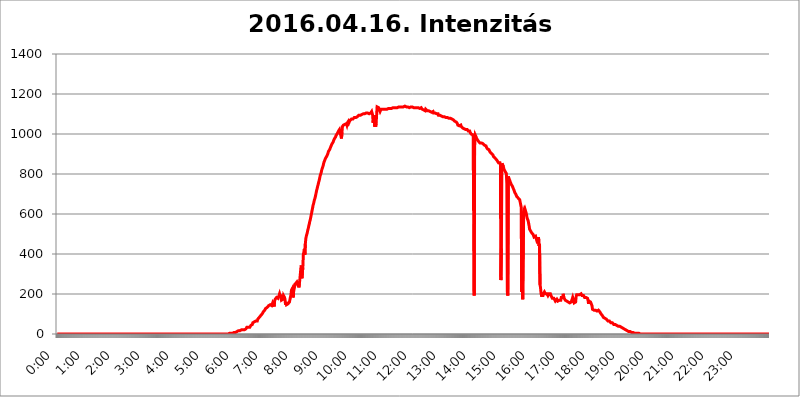
| Category | 2016.04.16. Intenzitás [W/m^2] |
|---|---|
| 0.0 | 0 |
| 0.0006944444444444445 | 0 |
| 0.001388888888888889 | 0 |
| 0.0020833333333333333 | 0 |
| 0.002777777777777778 | 0 |
| 0.003472222222222222 | 0 |
| 0.004166666666666667 | 0 |
| 0.004861111111111111 | 0 |
| 0.005555555555555556 | 0 |
| 0.0062499999999999995 | 0 |
| 0.006944444444444444 | 0 |
| 0.007638888888888889 | 0 |
| 0.008333333333333333 | 0 |
| 0.009027777777777779 | 0 |
| 0.009722222222222222 | 0 |
| 0.010416666666666666 | 0 |
| 0.011111111111111112 | 0 |
| 0.011805555555555555 | 0 |
| 0.012499999999999999 | 0 |
| 0.013194444444444444 | 0 |
| 0.013888888888888888 | 0 |
| 0.014583333333333332 | 0 |
| 0.015277777777777777 | 0 |
| 0.015972222222222224 | 0 |
| 0.016666666666666666 | 0 |
| 0.017361111111111112 | 0 |
| 0.018055555555555557 | 0 |
| 0.01875 | 0 |
| 0.019444444444444445 | 0 |
| 0.02013888888888889 | 0 |
| 0.020833333333333332 | 0 |
| 0.02152777777777778 | 0 |
| 0.022222222222222223 | 0 |
| 0.02291666666666667 | 0 |
| 0.02361111111111111 | 0 |
| 0.024305555555555556 | 0 |
| 0.024999999999999998 | 0 |
| 0.025694444444444447 | 0 |
| 0.02638888888888889 | 0 |
| 0.027083333333333334 | 0 |
| 0.027777777777777776 | 0 |
| 0.02847222222222222 | 0 |
| 0.029166666666666664 | 0 |
| 0.029861111111111113 | 0 |
| 0.030555555555555555 | 0 |
| 0.03125 | 0 |
| 0.03194444444444445 | 0 |
| 0.03263888888888889 | 0 |
| 0.03333333333333333 | 0 |
| 0.034027777777777775 | 0 |
| 0.034722222222222224 | 0 |
| 0.035416666666666666 | 0 |
| 0.036111111111111115 | 0 |
| 0.03680555555555556 | 0 |
| 0.0375 | 0 |
| 0.03819444444444444 | 0 |
| 0.03888888888888889 | 0 |
| 0.03958333333333333 | 0 |
| 0.04027777777777778 | 0 |
| 0.04097222222222222 | 0 |
| 0.041666666666666664 | 0 |
| 0.042361111111111106 | 0 |
| 0.04305555555555556 | 0 |
| 0.043750000000000004 | 0 |
| 0.044444444444444446 | 0 |
| 0.04513888888888889 | 0 |
| 0.04583333333333334 | 0 |
| 0.04652777777777778 | 0 |
| 0.04722222222222222 | 0 |
| 0.04791666666666666 | 0 |
| 0.04861111111111111 | 0 |
| 0.049305555555555554 | 0 |
| 0.049999999999999996 | 0 |
| 0.05069444444444445 | 0 |
| 0.051388888888888894 | 0 |
| 0.052083333333333336 | 0 |
| 0.05277777777777778 | 0 |
| 0.05347222222222222 | 0 |
| 0.05416666666666667 | 0 |
| 0.05486111111111111 | 0 |
| 0.05555555555555555 | 0 |
| 0.05625 | 0 |
| 0.05694444444444444 | 0 |
| 0.057638888888888885 | 0 |
| 0.05833333333333333 | 0 |
| 0.05902777777777778 | 0 |
| 0.059722222222222225 | 0 |
| 0.06041666666666667 | 0 |
| 0.061111111111111116 | 0 |
| 0.06180555555555556 | 0 |
| 0.0625 | 0 |
| 0.06319444444444444 | 0 |
| 0.06388888888888888 | 0 |
| 0.06458333333333334 | 0 |
| 0.06527777777777778 | 0 |
| 0.06597222222222222 | 0 |
| 0.06666666666666667 | 0 |
| 0.06736111111111111 | 0 |
| 0.06805555555555555 | 0 |
| 0.06874999999999999 | 0 |
| 0.06944444444444443 | 0 |
| 0.07013888888888889 | 0 |
| 0.07083333333333333 | 0 |
| 0.07152777777777779 | 0 |
| 0.07222222222222223 | 0 |
| 0.07291666666666667 | 0 |
| 0.07361111111111111 | 0 |
| 0.07430555555555556 | 0 |
| 0.075 | 0 |
| 0.07569444444444444 | 0 |
| 0.0763888888888889 | 0 |
| 0.07708333333333334 | 0 |
| 0.07777777777777778 | 0 |
| 0.07847222222222222 | 0 |
| 0.07916666666666666 | 0 |
| 0.0798611111111111 | 0 |
| 0.08055555555555556 | 0 |
| 0.08125 | 0 |
| 0.08194444444444444 | 0 |
| 0.08263888888888889 | 0 |
| 0.08333333333333333 | 0 |
| 0.08402777777777777 | 0 |
| 0.08472222222222221 | 0 |
| 0.08541666666666665 | 0 |
| 0.08611111111111112 | 0 |
| 0.08680555555555557 | 0 |
| 0.08750000000000001 | 0 |
| 0.08819444444444445 | 0 |
| 0.08888888888888889 | 0 |
| 0.08958333333333333 | 0 |
| 0.09027777777777778 | 0 |
| 0.09097222222222222 | 0 |
| 0.09166666666666667 | 0 |
| 0.09236111111111112 | 0 |
| 0.09305555555555556 | 0 |
| 0.09375 | 0 |
| 0.09444444444444444 | 0 |
| 0.09513888888888888 | 0 |
| 0.09583333333333333 | 0 |
| 0.09652777777777777 | 0 |
| 0.09722222222222222 | 0 |
| 0.09791666666666667 | 0 |
| 0.09861111111111111 | 0 |
| 0.09930555555555555 | 0 |
| 0.09999999999999999 | 0 |
| 0.10069444444444443 | 0 |
| 0.1013888888888889 | 0 |
| 0.10208333333333335 | 0 |
| 0.10277777777777779 | 0 |
| 0.10347222222222223 | 0 |
| 0.10416666666666667 | 0 |
| 0.10486111111111111 | 0 |
| 0.10555555555555556 | 0 |
| 0.10625 | 0 |
| 0.10694444444444444 | 0 |
| 0.1076388888888889 | 0 |
| 0.10833333333333334 | 0 |
| 0.10902777777777778 | 0 |
| 0.10972222222222222 | 0 |
| 0.1111111111111111 | 0 |
| 0.11180555555555556 | 0 |
| 0.11180555555555556 | 0 |
| 0.1125 | 0 |
| 0.11319444444444444 | 0 |
| 0.11388888888888889 | 0 |
| 0.11458333333333333 | 0 |
| 0.11527777777777777 | 0 |
| 0.11597222222222221 | 0 |
| 0.11666666666666665 | 0 |
| 0.1173611111111111 | 0 |
| 0.11805555555555557 | 0 |
| 0.11944444444444445 | 0 |
| 0.12013888888888889 | 0 |
| 0.12083333333333333 | 0 |
| 0.12152777777777778 | 0 |
| 0.12222222222222223 | 0 |
| 0.12291666666666667 | 0 |
| 0.12291666666666667 | 0 |
| 0.12361111111111112 | 0 |
| 0.12430555555555556 | 0 |
| 0.125 | 0 |
| 0.12569444444444444 | 0 |
| 0.12638888888888888 | 0 |
| 0.12708333333333333 | 0 |
| 0.16875 | 0 |
| 0.12847222222222224 | 0 |
| 0.12916666666666668 | 0 |
| 0.12986111111111112 | 0 |
| 0.13055555555555556 | 0 |
| 0.13125 | 0 |
| 0.13194444444444445 | 0 |
| 0.1326388888888889 | 0 |
| 0.13333333333333333 | 0 |
| 0.13402777777777777 | 0 |
| 0.13402777777777777 | 0 |
| 0.13472222222222222 | 0 |
| 0.13541666666666666 | 0 |
| 0.1361111111111111 | 0 |
| 0.13749999999999998 | 0 |
| 0.13819444444444443 | 0 |
| 0.1388888888888889 | 0 |
| 0.13958333333333334 | 0 |
| 0.14027777777777778 | 0 |
| 0.14097222222222222 | 0 |
| 0.14166666666666666 | 0 |
| 0.1423611111111111 | 0 |
| 0.14305555555555557 | 0 |
| 0.14375000000000002 | 0 |
| 0.14444444444444446 | 0 |
| 0.1451388888888889 | 0 |
| 0.1451388888888889 | 0 |
| 0.14652777777777778 | 0 |
| 0.14722222222222223 | 0 |
| 0.14791666666666667 | 0 |
| 0.1486111111111111 | 0 |
| 0.14930555555555555 | 0 |
| 0.15 | 0 |
| 0.15069444444444444 | 0 |
| 0.15138888888888888 | 0 |
| 0.15208333333333332 | 0 |
| 0.15277777777777776 | 0 |
| 0.15347222222222223 | 0 |
| 0.15416666666666667 | 0 |
| 0.15486111111111112 | 0 |
| 0.15555555555555556 | 0 |
| 0.15625 | 0 |
| 0.15694444444444444 | 0 |
| 0.15763888888888888 | 0 |
| 0.15833333333333333 | 0 |
| 0.15902777777777777 | 0 |
| 0.15972222222222224 | 0 |
| 0.16041666666666668 | 0 |
| 0.16111111111111112 | 0 |
| 0.16180555555555556 | 0 |
| 0.1625 | 0 |
| 0.16319444444444445 | 0 |
| 0.1638888888888889 | 0 |
| 0.16458333333333333 | 0 |
| 0.16527777777777777 | 0 |
| 0.16597222222222222 | 0 |
| 0.16666666666666666 | 0 |
| 0.1673611111111111 | 0 |
| 0.16805555555555554 | 0 |
| 0.16874999999999998 | 0 |
| 0.16944444444444443 | 0 |
| 0.17013888888888887 | 0 |
| 0.1708333333333333 | 0 |
| 0.17152777777777775 | 0 |
| 0.17222222222222225 | 0 |
| 0.1729166666666667 | 0 |
| 0.17361111111111113 | 0 |
| 0.17430555555555557 | 0 |
| 0.17500000000000002 | 0 |
| 0.17569444444444446 | 0 |
| 0.1763888888888889 | 0 |
| 0.17708333333333334 | 0 |
| 0.17777777777777778 | 0 |
| 0.17847222222222223 | 0 |
| 0.17916666666666667 | 0 |
| 0.1798611111111111 | 0 |
| 0.18055555555555555 | 0 |
| 0.18125 | 0 |
| 0.18194444444444444 | 0 |
| 0.1826388888888889 | 0 |
| 0.18333333333333335 | 0 |
| 0.1840277777777778 | 0 |
| 0.18472222222222223 | 0 |
| 0.18541666666666667 | 0 |
| 0.18611111111111112 | 0 |
| 0.18680555555555556 | 0 |
| 0.1875 | 0 |
| 0.18819444444444444 | 0 |
| 0.18888888888888888 | 0 |
| 0.18958333333333333 | 0 |
| 0.19027777777777777 | 0 |
| 0.1909722222222222 | 0 |
| 0.19166666666666665 | 0 |
| 0.19236111111111112 | 0 |
| 0.19305555555555554 | 0 |
| 0.19375 | 0 |
| 0.19444444444444445 | 0 |
| 0.1951388888888889 | 0 |
| 0.19583333333333333 | 0 |
| 0.19652777777777777 | 0 |
| 0.19722222222222222 | 0 |
| 0.19791666666666666 | 0 |
| 0.1986111111111111 | 0 |
| 0.19930555555555554 | 0 |
| 0.19999999999999998 | 0 |
| 0.20069444444444443 | 0 |
| 0.20138888888888887 | 0 |
| 0.2020833333333333 | 0 |
| 0.2027777777777778 | 0 |
| 0.2034722222222222 | 0 |
| 0.2041666666666667 | 0 |
| 0.20486111111111113 | 0 |
| 0.20555555555555557 | 0 |
| 0.20625000000000002 | 0 |
| 0.20694444444444446 | 0 |
| 0.2076388888888889 | 0 |
| 0.20833333333333334 | 0 |
| 0.20902777777777778 | 0 |
| 0.20972222222222223 | 0 |
| 0.21041666666666667 | 0 |
| 0.2111111111111111 | 0 |
| 0.21180555555555555 | 0 |
| 0.2125 | 0 |
| 0.21319444444444444 | 0 |
| 0.2138888888888889 | 0 |
| 0.21458333333333335 | 0 |
| 0.2152777777777778 | 0 |
| 0.21597222222222223 | 0 |
| 0.21666666666666667 | 0 |
| 0.21736111111111112 | 0 |
| 0.21805555555555556 | 0 |
| 0.21875 | 0 |
| 0.21944444444444444 | 0 |
| 0.22013888888888888 | 0 |
| 0.22083333333333333 | 0 |
| 0.22152777777777777 | 0 |
| 0.2222222222222222 | 0 |
| 0.22291666666666665 | 0 |
| 0.2236111111111111 | 0 |
| 0.22430555555555556 | 0 |
| 0.225 | 0 |
| 0.22569444444444445 | 0 |
| 0.2263888888888889 | 0 |
| 0.22708333333333333 | 0 |
| 0.22777777777777777 | 0 |
| 0.22847222222222222 | 0 |
| 0.22916666666666666 | 0 |
| 0.2298611111111111 | 0 |
| 0.23055555555555554 | 0 |
| 0.23124999999999998 | 0 |
| 0.23194444444444443 | 0 |
| 0.23263888888888887 | 0 |
| 0.2333333333333333 | 0 |
| 0.2340277777777778 | 0 |
| 0.2347222222222222 | 0 |
| 0.2354166666666667 | 0 |
| 0.23611111111111113 | 0 |
| 0.23680555555555557 | 0 |
| 0.23750000000000002 | 0 |
| 0.23819444444444446 | 0 |
| 0.2388888888888889 | 0 |
| 0.23958333333333334 | 0 |
| 0.24027777777777778 | 0 |
| 0.24097222222222223 | 0 |
| 0.24166666666666667 | 3.525 |
| 0.2423611111111111 | 3.525 |
| 0.24305555555555555 | 3.525 |
| 0.24375 | 3.525 |
| 0.24444444444444446 | 3.525 |
| 0.24513888888888888 | 3.525 |
| 0.24583333333333335 | 3.525 |
| 0.2465277777777778 | 3.525 |
| 0.24722222222222223 | 7.887 |
| 0.24791666666666667 | 7.887 |
| 0.24861111111111112 | 7.887 |
| 0.24930555555555556 | 7.887 |
| 0.25 | 7.887 |
| 0.25069444444444444 | 12.257 |
| 0.2513888888888889 | 12.257 |
| 0.2520833333333333 | 12.257 |
| 0.25277777777777777 | 12.257 |
| 0.2534722222222222 | 12.257 |
| 0.25416666666666665 | 16.636 |
| 0.2548611111111111 | 16.636 |
| 0.2555555555555556 | 16.636 |
| 0.25625000000000003 | 16.636 |
| 0.2569444444444445 | 16.636 |
| 0.2576388888888889 | 21.024 |
| 0.25833333333333336 | 21.024 |
| 0.2590277777777778 | 21.024 |
| 0.25972222222222224 | 21.024 |
| 0.2604166666666667 | 21.024 |
| 0.2611111111111111 | 21.024 |
| 0.26180555555555557 | 21.024 |
| 0.2625 | 21.024 |
| 0.26319444444444445 | 25.419 |
| 0.2638888888888889 | 25.419 |
| 0.26458333333333334 | 25.419 |
| 0.2652777777777778 | 29.823 |
| 0.2659722222222222 | 34.234 |
| 0.26666666666666666 | 34.234 |
| 0.2673611111111111 | 34.234 |
| 0.26805555555555555 | 34.234 |
| 0.26875 | 34.234 |
| 0.26944444444444443 | 34.234 |
| 0.2701388888888889 | 34.234 |
| 0.2708333333333333 | 38.653 |
| 0.27152777777777776 | 43.079 |
| 0.2722222222222222 | 47.511 |
| 0.27291666666666664 | 47.511 |
| 0.2736111111111111 | 47.511 |
| 0.2743055555555555 | 56.398 |
| 0.27499999999999997 | 60.85 |
| 0.27569444444444446 | 60.85 |
| 0.27638888888888885 | 60.85 |
| 0.27708333333333335 | 65.31 |
| 0.2777777777777778 | 65.31 |
| 0.27847222222222223 | 65.31 |
| 0.2791666666666667 | 69.775 |
| 0.2798611111111111 | 69.775 |
| 0.28055555555555556 | 65.31 |
| 0.28125 | 74.246 |
| 0.28194444444444444 | 78.722 |
| 0.2826388888888889 | 78.722 |
| 0.2833333333333333 | 83.205 |
| 0.28402777777777777 | 83.205 |
| 0.2847222222222222 | 87.692 |
| 0.28541666666666665 | 92.184 |
| 0.28611111111111115 | 92.184 |
| 0.28680555555555554 | 96.682 |
| 0.28750000000000003 | 101.184 |
| 0.2881944444444445 | 105.69 |
| 0.2888888888888889 | 110.201 |
| 0.28958333333333336 | 110.201 |
| 0.2902777777777778 | 114.716 |
| 0.29097222222222224 | 119.235 |
| 0.2916666666666667 | 123.758 |
| 0.2923611111111111 | 128.284 |
| 0.29305555555555557 | 128.284 |
| 0.29375 | 132.814 |
| 0.29444444444444445 | 132.814 |
| 0.2951388888888889 | 137.347 |
| 0.29583333333333334 | 137.347 |
| 0.2965277777777778 | 141.884 |
| 0.2972222222222222 | 141.884 |
| 0.29791666666666666 | 146.423 |
| 0.2986111111111111 | 146.423 |
| 0.29930555555555555 | 150.964 |
| 0.3 | 150.964 |
| 0.30069444444444443 | 141.884 |
| 0.3013888888888889 | 141.884 |
| 0.3020833333333333 | 155.509 |
| 0.30277777777777776 | 160.056 |
| 0.3034722222222222 | 150.964 |
| 0.30416666666666664 | 137.347 |
| 0.3048611111111111 | 164.605 |
| 0.3055555555555555 | 173.709 |
| 0.30624999999999997 | 178.264 |
| 0.3069444444444444 | 178.264 |
| 0.3076388888888889 | 182.82 |
| 0.30833333333333335 | 178.264 |
| 0.3090277777777778 | 178.264 |
| 0.30972222222222223 | 178.264 |
| 0.3104166666666667 | 182.82 |
| 0.3111111111111111 | 182.82 |
| 0.31180555555555556 | 201.058 |
| 0.3125 | 191.937 |
| 0.31319444444444444 | 182.82 |
| 0.3138888888888889 | 196.497 |
| 0.3145833333333333 | 169.156 |
| 0.31527777777777777 | 169.156 |
| 0.3159722222222222 | 169.156 |
| 0.31666666666666665 | 173.709 |
| 0.31736111111111115 | 191.937 |
| 0.31805555555555554 | 191.937 |
| 0.31875000000000003 | 182.82 |
| 0.3194444444444445 | 173.709 |
| 0.3201388888888889 | 146.423 |
| 0.32083333333333336 | 160.056 |
| 0.3215277777777778 | 146.423 |
| 0.32222222222222224 | 150.964 |
| 0.3229166666666667 | 146.423 |
| 0.3236111111111111 | 150.964 |
| 0.32430555555555557 | 150.964 |
| 0.325 | 155.509 |
| 0.32569444444444445 | 160.056 |
| 0.3263888888888889 | 160.056 |
| 0.32708333333333334 | 155.509 |
| 0.3277777777777778 | 196.497 |
| 0.3284722222222222 | 219.309 |
| 0.32916666666666666 | 219.309 |
| 0.3298611111111111 | 228.436 |
| 0.33055555555555555 | 182.82 |
| 0.33125 | 191.937 |
| 0.33194444444444443 | 242.127 |
| 0.3326388888888889 | 233 |
| 0.3333333333333333 | 242.127 |
| 0.3340277777777778 | 251.251 |
| 0.3347222222222222 | 251.251 |
| 0.3354166666666667 | 251.251 |
| 0.3361111111111111 | 260.373 |
| 0.3368055555555556 | 260.373 |
| 0.33749999999999997 | 255.813 |
| 0.33819444444444446 | 242.127 |
| 0.33888888888888885 | 233 |
| 0.33958333333333335 | 251.251 |
| 0.34027777777777773 | 274.047 |
| 0.34097222222222223 | 301.354 |
| 0.3416666666666666 | 328.584 |
| 0.3423611111111111 | 342.162 |
| 0.3430555555555555 | 278.603 |
| 0.34375 | 278.603 |
| 0.3444444444444445 | 333.113 |
| 0.3451388888888889 | 396.164 |
| 0.3458333333333334 | 409.574 |
| 0.34652777777777777 | 422.943 |
| 0.34722222222222227 | 396.164 |
| 0.34791666666666665 | 449.551 |
| 0.34861111111111115 | 475.972 |
| 0.34930555555555554 | 489.108 |
| 0.35000000000000003 | 497.836 |
| 0.3506944444444444 | 506.542 |
| 0.3513888888888889 | 519.555 |
| 0.3520833333333333 | 528.2 |
| 0.3527777777777778 | 541.121 |
| 0.3534722222222222 | 549.704 |
| 0.3541666666666667 | 562.53 |
| 0.3548611111111111 | 571.049 |
| 0.35555555555555557 | 583.779 |
| 0.35625 | 596.45 |
| 0.35694444444444445 | 609.062 |
| 0.3576388888888889 | 621.613 |
| 0.35833333333333334 | 634.105 |
| 0.3590277777777778 | 646.537 |
| 0.3597222222222222 | 654.791 |
| 0.36041666666666666 | 667.123 |
| 0.3611111111111111 | 675.311 |
| 0.36180555555555555 | 683.473 |
| 0.3625 | 695.666 |
| 0.36319444444444443 | 707.8 |
| 0.3638888888888889 | 719.877 |
| 0.3645833333333333 | 727.896 |
| 0.3652777777777778 | 739.877 |
| 0.3659722222222222 | 747.834 |
| 0.3666666666666667 | 759.723 |
| 0.3673611111111111 | 767.62 |
| 0.3680555555555556 | 779.42 |
| 0.36874999999999997 | 791.169 |
| 0.36944444444444446 | 798.974 |
| 0.37013888888888885 | 806.757 |
| 0.37083333333333335 | 818.392 |
| 0.37152777777777773 | 822.26 |
| 0.37222222222222223 | 833.834 |
| 0.3729166666666666 | 841.526 |
| 0.3736111111111111 | 853.029 |
| 0.3743055555555555 | 860.676 |
| 0.375 | 864.493 |
| 0.3756944444444445 | 860.676 |
| 0.3763888888888889 | 879.719 |
| 0.3770833333333334 | 883.516 |
| 0.37777777777777777 | 887.309 |
| 0.37847222222222227 | 891.099 |
| 0.37916666666666665 | 898.668 |
| 0.37986111111111115 | 906.223 |
| 0.38055555555555554 | 913.766 |
| 0.38125000000000003 | 917.534 |
| 0.3819444444444444 | 921.298 |
| 0.3826388888888889 | 917.534 |
| 0.3833333333333333 | 921.298 |
| 0.3840277777777778 | 940.082 |
| 0.3847222222222222 | 943.832 |
| 0.3854166666666667 | 951.327 |
| 0.3861111111111111 | 951.327 |
| 0.38680555555555557 | 958.814 |
| 0.3875 | 966.295 |
| 0.38819444444444445 | 970.034 |
| 0.3888888888888889 | 977.508 |
| 0.38958333333333334 | 981.244 |
| 0.3902777777777778 | 984.98 |
| 0.3909722222222222 | 992.448 |
| 0.39166666666666666 | 992.448 |
| 0.3923611111111111 | 988.714 |
| 0.39305555555555555 | 1003.65 |
| 0.39375 | 1007.383 |
| 0.39444444444444443 | 1014.852 |
| 0.3951388888888889 | 1014.852 |
| 0.3958333333333333 | 1022.323 |
| 0.3965277777777778 | 1026.06 |
| 0.3972222222222222 | 1022.323 |
| 0.3979166666666667 | 988.714 |
| 0.3986111111111111 | 977.508 |
| 0.3993055555555556 | 1007.383 |
| 0.39999999999999997 | 1037.277 |
| 0.40069444444444446 | 1037.277 |
| 0.40138888888888885 | 1044.762 |
| 0.40208333333333335 | 1044.762 |
| 0.40277777777777773 | 1044.762 |
| 0.40347222222222223 | 1048.508 |
| 0.4041666666666666 | 1052.255 |
| 0.4048611111111111 | 1052.255 |
| 0.4055555555555555 | 1052.255 |
| 0.40625 | 1044.762 |
| 0.4069444444444445 | 1056.004 |
| 0.4076388888888889 | 1059.756 |
| 0.4083333333333334 | 1063.51 |
| 0.40902777777777777 | 1056.004 |
| 0.40972222222222227 | 1056.004 |
| 0.41041666666666665 | 1067.267 |
| 0.41111111111111115 | 1067.267 |
| 0.41180555555555554 | 1067.267 |
| 0.41250000000000003 | 1074.789 |
| 0.4131944444444444 | 1074.789 |
| 0.4138888888888889 | 1074.789 |
| 0.4145833333333333 | 1074.789 |
| 0.4152777777777778 | 1078.555 |
| 0.4159722222222222 | 1078.555 |
| 0.4166666666666667 | 1082.324 |
| 0.4173611111111111 | 1082.324 |
| 0.41805555555555557 | 1082.324 |
| 0.41875 | 1082.324 |
| 0.41944444444444445 | 1086.097 |
| 0.4201388888888889 | 1086.097 |
| 0.42083333333333334 | 1086.097 |
| 0.4215277777777778 | 1089.873 |
| 0.4222222222222222 | 1089.873 |
| 0.42291666666666666 | 1093.653 |
| 0.4236111111111111 | 1093.653 |
| 0.42430555555555555 | 1093.653 |
| 0.425 | 1093.653 |
| 0.42569444444444443 | 1093.653 |
| 0.4263888888888889 | 1097.437 |
| 0.4270833333333333 | 1097.437 |
| 0.4277777777777778 | 1097.437 |
| 0.4284722222222222 | 1101.226 |
| 0.4291666666666667 | 1101.226 |
| 0.4298611111111111 | 1101.226 |
| 0.4305555555555556 | 1101.226 |
| 0.43124999999999997 | 1101.226 |
| 0.43194444444444446 | 1101.226 |
| 0.43263888888888885 | 1105.019 |
| 0.43333333333333335 | 1105.019 |
| 0.43402777777777773 | 1105.019 |
| 0.43472222222222223 | 1101.226 |
| 0.4354166666666666 | 1105.019 |
| 0.4361111111111111 | 1105.019 |
| 0.4368055555555555 | 1105.019 |
| 0.4375 | 1101.226 |
| 0.4381944444444445 | 1101.226 |
| 0.4388888888888889 | 1101.226 |
| 0.4395833333333334 | 1105.019 |
| 0.44027777777777777 | 1108.816 |
| 0.44097222222222227 | 1112.618 |
| 0.44166666666666665 | 1112.618 |
| 0.44236111111111115 | 1093.653 |
| 0.44305555555555554 | 1056.004 |
| 0.44375000000000003 | 1078.555 |
| 0.4444444444444444 | 1093.653 |
| 0.4451388888888889 | 1037.277 |
| 0.4458333333333333 | 1052.255 |
| 0.4465277777777778 | 1037.277 |
| 0.4472222222222222 | 1052.255 |
| 0.4479166666666667 | 1093.653 |
| 0.4486111111111111 | 1135.543 |
| 0.44930555555555557 | 1131.708 |
| 0.45 | 1131.708 |
| 0.45069444444444445 | 1131.708 |
| 0.4513888888888889 | 1127.879 |
| 0.45208333333333334 | 1127.879 |
| 0.4527777777777778 | 1112.618 |
| 0.4534722222222222 | 1116.426 |
| 0.45416666666666666 | 1124.056 |
| 0.4548611111111111 | 1124.056 |
| 0.45555555555555555 | 1124.056 |
| 0.45625 | 1124.056 |
| 0.45694444444444443 | 1124.056 |
| 0.4576388888888889 | 1124.056 |
| 0.4583333333333333 | 1124.056 |
| 0.4590277777777778 | 1120.238 |
| 0.4597222222222222 | 1120.238 |
| 0.4604166666666667 | 1124.056 |
| 0.4611111111111111 | 1124.056 |
| 0.4618055555555556 | 1124.056 |
| 0.46249999999999997 | 1124.056 |
| 0.46319444444444446 | 1124.056 |
| 0.46388888888888885 | 1127.879 |
| 0.46458333333333335 | 1127.879 |
| 0.46527777777777773 | 1127.879 |
| 0.46597222222222223 | 1127.879 |
| 0.4666666666666666 | 1127.879 |
| 0.4673611111111111 | 1127.879 |
| 0.4680555555555555 | 1127.879 |
| 0.46875 | 1127.879 |
| 0.4694444444444445 | 1131.708 |
| 0.4701388888888889 | 1131.708 |
| 0.4708333333333334 | 1131.708 |
| 0.47152777777777777 | 1131.708 |
| 0.47222222222222227 | 1131.708 |
| 0.47291666666666665 | 1131.708 |
| 0.47361111111111115 | 1131.708 |
| 0.47430555555555554 | 1131.708 |
| 0.47500000000000003 | 1131.708 |
| 0.4756944444444444 | 1131.708 |
| 0.4763888888888889 | 1131.708 |
| 0.4770833333333333 | 1131.708 |
| 0.4777777777777778 | 1135.543 |
| 0.4784722222222222 | 1131.708 |
| 0.4791666666666667 | 1135.543 |
| 0.4798611111111111 | 1135.543 |
| 0.48055555555555557 | 1131.708 |
| 0.48125 | 1135.543 |
| 0.48194444444444445 | 1139.384 |
| 0.4826388888888889 | 1135.543 |
| 0.48333333333333334 | 1135.543 |
| 0.4840277777777778 | 1135.543 |
| 0.4847222222222222 | 1139.384 |
| 0.48541666666666666 | 1135.543 |
| 0.4861111111111111 | 1135.543 |
| 0.48680555555555555 | 1135.543 |
| 0.4875 | 1139.384 |
| 0.48819444444444443 | 1135.543 |
| 0.4888888888888889 | 1135.543 |
| 0.4895833333333333 | 1135.543 |
| 0.4902777777777778 | 1131.708 |
| 0.4909722222222222 | 1131.708 |
| 0.4916666666666667 | 1135.543 |
| 0.4923611111111111 | 1135.543 |
| 0.4930555555555556 | 1131.708 |
| 0.49374999999999997 | 1131.708 |
| 0.49444444444444446 | 1131.708 |
| 0.49513888888888885 | 1131.708 |
| 0.49583333333333335 | 1135.543 |
| 0.49652777777777773 | 1131.708 |
| 0.49722222222222223 | 1135.543 |
| 0.4979166666666666 | 1135.543 |
| 0.4986111111111111 | 1135.543 |
| 0.4993055555555555 | 1135.543 |
| 0.5 | 1131.708 |
| 0.5006944444444444 | 1135.543 |
| 0.5013888888888889 | 1131.708 |
| 0.5020833333333333 | 1131.708 |
| 0.5027777777777778 | 1135.543 |
| 0.5034722222222222 | 1131.708 |
| 0.5041666666666667 | 1131.708 |
| 0.5048611111111111 | 1131.708 |
| 0.5055555555555555 | 1131.708 |
| 0.50625 | 1131.708 |
| 0.5069444444444444 | 1131.708 |
| 0.5076388888888889 | 1127.879 |
| 0.5083333333333333 | 1127.879 |
| 0.5090277777777777 | 1127.879 |
| 0.5097222222222222 | 1127.879 |
| 0.5104166666666666 | 1131.708 |
| 0.5111111111111112 | 1127.879 |
| 0.5118055555555555 | 1124.056 |
| 0.5125000000000001 | 1124.056 |
| 0.5131944444444444 | 1124.056 |
| 0.513888888888889 | 1120.238 |
| 0.5145833333333333 | 1120.238 |
| 0.5152777777777778 | 1116.426 |
| 0.5159722222222222 | 1116.426 |
| 0.5166666666666667 | 1124.056 |
| 0.517361111111111 | 1120.238 |
| 0.5180555555555556 | 1120.238 |
| 0.5187499999999999 | 1116.426 |
| 0.5194444444444445 | 1116.426 |
| 0.5201388888888888 | 1116.426 |
| 0.5208333333333334 | 1116.426 |
| 0.5215277777777778 | 1116.426 |
| 0.5222222222222223 | 1116.426 |
| 0.5229166666666667 | 1112.618 |
| 0.5236111111111111 | 1108.816 |
| 0.5243055555555556 | 1112.618 |
| 0.525 | 1108.816 |
| 0.5256944444444445 | 1108.816 |
| 0.5263888888888889 | 1108.816 |
| 0.5270833333333333 | 1112.618 |
| 0.5277777777777778 | 1105.019 |
| 0.5284722222222222 | 1108.816 |
| 0.5291666666666667 | 1105.019 |
| 0.5298611111111111 | 1105.019 |
| 0.5305555555555556 | 1101.226 |
| 0.53125 | 1105.019 |
| 0.5319444444444444 | 1101.226 |
| 0.5326388888888889 | 1101.226 |
| 0.5333333333333333 | 1101.226 |
| 0.5340277777777778 | 1101.226 |
| 0.5347222222222222 | 1093.653 |
| 0.5354166666666667 | 1097.437 |
| 0.5361111111111111 | 1097.437 |
| 0.5368055555555555 | 1093.653 |
| 0.5375 | 1097.437 |
| 0.5381944444444444 | 1093.653 |
| 0.5388888888888889 | 1089.873 |
| 0.5395833333333333 | 1089.873 |
| 0.5402777777777777 | 1086.097 |
| 0.5409722222222222 | 1086.097 |
| 0.5416666666666666 | 1089.873 |
| 0.5423611111111112 | 1089.873 |
| 0.5430555555555555 | 1086.097 |
| 0.5437500000000001 | 1086.097 |
| 0.5444444444444444 | 1082.324 |
| 0.545138888888889 | 1082.324 |
| 0.5458333333333333 | 1082.324 |
| 0.5465277777777778 | 1078.555 |
| 0.5472222222222222 | 1082.324 |
| 0.5479166666666667 | 1082.324 |
| 0.548611111111111 | 1082.324 |
| 0.5493055555555556 | 1078.555 |
| 0.5499999999999999 | 1074.789 |
| 0.5506944444444445 | 1078.555 |
| 0.5513888888888888 | 1078.555 |
| 0.5520833333333334 | 1078.555 |
| 0.5527777777777778 | 1074.789 |
| 0.5534722222222223 | 1074.789 |
| 0.5541666666666667 | 1071.027 |
| 0.5548611111111111 | 1071.027 |
| 0.5555555555555556 | 1071.027 |
| 0.55625 | 1067.267 |
| 0.5569444444444445 | 1067.267 |
| 0.5576388888888889 | 1063.51 |
| 0.5583333333333333 | 1059.756 |
| 0.5590277777777778 | 1059.756 |
| 0.5597222222222222 | 1059.756 |
| 0.5604166666666667 | 1056.004 |
| 0.5611111111111111 | 1052.255 |
| 0.5618055555555556 | 1044.762 |
| 0.5625 | 1048.508 |
| 0.5631944444444444 | 1044.762 |
| 0.5638888888888889 | 1041.019 |
| 0.5645833333333333 | 1044.762 |
| 0.5652777777777778 | 1044.762 |
| 0.5659722222222222 | 1044.762 |
| 0.5666666666666667 | 1037.277 |
| 0.5673611111111111 | 1037.277 |
| 0.5680555555555555 | 1037.277 |
| 0.56875 | 1029.798 |
| 0.5694444444444444 | 1029.798 |
| 0.5701388888888889 | 1026.06 |
| 0.5708333333333333 | 1026.06 |
| 0.5715277777777777 | 1029.798 |
| 0.5722222222222222 | 1022.323 |
| 0.5729166666666666 | 1022.323 |
| 0.5736111111111112 | 1022.323 |
| 0.5743055555555555 | 1022.323 |
| 0.5750000000000001 | 1022.323 |
| 0.5756944444444444 | 1022.323 |
| 0.576388888888889 | 1014.852 |
| 0.5770833333333333 | 1011.118 |
| 0.5777777777777778 | 1014.852 |
| 0.5784722222222222 | 1014.852 |
| 0.5791666666666667 | 1007.383 |
| 0.579861111111111 | 1007.383 |
| 0.5805555555555556 | 999.916 |
| 0.5812499999999999 | 999.916 |
| 0.5819444444444445 | 996.182 |
| 0.5826388888888888 | 996.182 |
| 0.5833333333333334 | 988.714 |
| 0.5840277777777778 | 988.714 |
| 0.5847222222222223 | 191.937 |
| 0.5854166666666667 | 977.508 |
| 0.5861111111111111 | 996.182 |
| 0.5868055555555556 | 992.448 |
| 0.5875 | 984.98 |
| 0.5881944444444445 | 977.508 |
| 0.5888888888888889 | 973.772 |
| 0.5895833333333333 | 970.034 |
| 0.5902777777777778 | 966.295 |
| 0.5909722222222222 | 962.555 |
| 0.5916666666666667 | 958.814 |
| 0.5923611111111111 | 958.814 |
| 0.5930555555555556 | 955.071 |
| 0.59375 | 955.071 |
| 0.5944444444444444 | 955.071 |
| 0.5951388888888889 | 955.071 |
| 0.5958333333333333 | 955.071 |
| 0.5965277777777778 | 955.071 |
| 0.5972222222222222 | 951.327 |
| 0.5979166666666667 | 947.58 |
| 0.5986111111111111 | 947.58 |
| 0.5993055555555555 | 943.832 |
| 0.6 | 940.082 |
| 0.6006944444444444 | 940.082 |
| 0.6013888888888889 | 940.082 |
| 0.6020833333333333 | 932.576 |
| 0.6027777777777777 | 928.819 |
| 0.6034722222222222 | 925.06 |
| 0.6041666666666666 | 925.06 |
| 0.6048611111111112 | 921.298 |
| 0.6055555555555555 | 921.298 |
| 0.6062500000000001 | 917.534 |
| 0.6069444444444444 | 909.996 |
| 0.607638888888889 | 909.996 |
| 0.6083333333333333 | 906.223 |
| 0.6090277777777778 | 902.447 |
| 0.6097222222222222 | 902.447 |
| 0.6104166666666667 | 898.668 |
| 0.611111111111111 | 894.885 |
| 0.6118055555555556 | 887.309 |
| 0.6124999999999999 | 887.309 |
| 0.6131944444444445 | 887.309 |
| 0.6138888888888888 | 879.719 |
| 0.6145833333333334 | 883.516 |
| 0.6152777777777778 | 875.918 |
| 0.6159722222222223 | 872.114 |
| 0.6166666666666667 | 868.305 |
| 0.6173611111111111 | 864.493 |
| 0.6180555555555556 | 864.493 |
| 0.61875 | 856.855 |
| 0.6194444444444445 | 860.676 |
| 0.6201388888888889 | 856.855 |
| 0.6208333333333333 | 856.855 |
| 0.6215277777777778 | 845.365 |
| 0.6222222222222222 | 269.49 |
| 0.6229166666666667 | 427.39 |
| 0.6236111111111111 | 853.029 |
| 0.6243055555555556 | 856.855 |
| 0.625 | 853.029 |
| 0.6256944444444444 | 837.682 |
| 0.6263888888888889 | 826.123 |
| 0.6270833333333333 | 822.26 |
| 0.6277777777777778 | 814.519 |
| 0.6284722222222222 | 814.519 |
| 0.6291666666666667 | 810.641 |
| 0.6298611111111111 | 802.868 |
| 0.6305555555555555 | 751.803 |
| 0.63125 | 210.182 |
| 0.6319444444444444 | 191.937 |
| 0.6326388888888889 | 787.258 |
| 0.6333333333333333 | 779.42 |
| 0.6340277777777777 | 775.492 |
| 0.6347222222222222 | 767.62 |
| 0.6354166666666666 | 759.723 |
| 0.6361111111111112 | 755.766 |
| 0.6368055555555555 | 747.834 |
| 0.6375000000000001 | 743.859 |
| 0.6381944444444444 | 739.877 |
| 0.638888888888889 | 735.89 |
| 0.6395833333333333 | 727.896 |
| 0.6402777777777778 | 723.889 |
| 0.6409722222222222 | 715.858 |
| 0.6416666666666667 | 707.8 |
| 0.642361111111111 | 707.8 |
| 0.6430555555555556 | 699.717 |
| 0.6437499999999999 | 695.666 |
| 0.6444444444444445 | 687.544 |
| 0.6451388888888888 | 687.544 |
| 0.6458333333333334 | 683.473 |
| 0.6465277777777778 | 679.395 |
| 0.6472222222222223 | 679.395 |
| 0.6479166666666667 | 675.311 |
| 0.6486111111111111 | 671.22 |
| 0.6493055555555556 | 675.311 |
| 0.65 | 667.123 |
| 0.6506944444444445 | 634.105 |
| 0.6513888888888889 | 210.182 |
| 0.6520833333333333 | 493.475 |
| 0.6527777777777778 | 173.709 |
| 0.6534722222222222 | 178.264 |
| 0.6541666666666667 | 613.252 |
| 0.6548611111111111 | 621.613 |
| 0.6555555555555556 | 613.252 |
| 0.65625 | 621.613 |
| 0.6569444444444444 | 617.436 |
| 0.6576388888888889 | 604.864 |
| 0.6583333333333333 | 592.233 |
| 0.6590277777777778 | 579.542 |
| 0.6597222222222222 | 575.299 |
| 0.6604166666666667 | 566.793 |
| 0.6611111111111111 | 553.986 |
| 0.6618055555555555 | 541.121 |
| 0.6625 | 523.88 |
| 0.6631944444444444 | 523.88 |
| 0.6638888888888889 | 515.223 |
| 0.6645833333333333 | 510.885 |
| 0.6652777777777777 | 506.542 |
| 0.6659722222222222 | 506.542 |
| 0.6666666666666666 | 502.192 |
| 0.6673611111111111 | 497.836 |
| 0.6680555555555556 | 493.475 |
| 0.6687500000000001 | 484.735 |
| 0.6694444444444444 | 480.356 |
| 0.6701388888888888 | 480.356 |
| 0.6708333333333334 | 489.108 |
| 0.6715277777777778 | 480.356 |
| 0.6722222222222222 | 471.582 |
| 0.6729166666666666 | 475.972 |
| 0.6736111111111112 | 484.735 |
| 0.6743055555555556 | 453.968 |
| 0.6749999999999999 | 484.735 |
| 0.6756944444444444 | 440.702 |
| 0.6763888888888889 | 449.551 |
| 0.6770833333333334 | 246.689 |
| 0.6777777777777777 | 233 |
| 0.6784722222222223 | 205.62 |
| 0.6791666666666667 | 191.937 |
| 0.6798611111111111 | 191.937 |
| 0.6805555555555555 | 191.937 |
| 0.68125 | 191.937 |
| 0.6819444444444445 | 201.058 |
| 0.6826388888888889 | 205.62 |
| 0.6833333333333332 | 210.182 |
| 0.6840277777777778 | 205.62 |
| 0.6847222222222222 | 201.058 |
| 0.6854166666666667 | 201.058 |
| 0.686111111111111 | 201.058 |
| 0.6868055555555556 | 201.058 |
| 0.6875 | 196.497 |
| 0.6881944444444444 | 191.937 |
| 0.688888888888889 | 191.937 |
| 0.6895833333333333 | 201.058 |
| 0.6902777777777778 | 196.497 |
| 0.6909722222222222 | 201.058 |
| 0.6916666666666668 | 201.058 |
| 0.6923611111111111 | 201.058 |
| 0.6930555555555555 | 187.378 |
| 0.69375 | 182.82 |
| 0.6944444444444445 | 178.264 |
| 0.6951388888888889 | 178.264 |
| 0.6958333333333333 | 178.264 |
| 0.6965277777777777 | 178.264 |
| 0.6972222222222223 | 173.709 |
| 0.6979166666666666 | 173.709 |
| 0.6986111111111111 | 164.605 |
| 0.6993055555555556 | 164.605 |
| 0.7000000000000001 | 169.156 |
| 0.7006944444444444 | 173.709 |
| 0.7013888888888888 | 169.156 |
| 0.7020833333333334 | 164.605 |
| 0.7027777777777778 | 169.156 |
| 0.7034722222222222 | 169.156 |
| 0.7041666666666666 | 169.156 |
| 0.7048611111111112 | 164.605 |
| 0.7055555555555556 | 164.605 |
| 0.7062499999999999 | 169.156 |
| 0.7069444444444444 | 182.82 |
| 0.7076388888888889 | 187.378 |
| 0.7083333333333334 | 182.82 |
| 0.7090277777777777 | 182.82 |
| 0.7097222222222223 | 201.058 |
| 0.7104166666666667 | 182.82 |
| 0.7111111111111111 | 182.82 |
| 0.7118055555555555 | 178.264 |
| 0.7125 | 169.156 |
| 0.7131944444444445 | 164.605 |
| 0.7138888888888889 | 164.605 |
| 0.7145833333333332 | 164.605 |
| 0.7152777777777778 | 164.605 |
| 0.7159722222222222 | 164.605 |
| 0.7166666666666667 | 160.056 |
| 0.717361111111111 | 160.056 |
| 0.7180555555555556 | 155.509 |
| 0.71875 | 155.509 |
| 0.7194444444444444 | 155.509 |
| 0.720138888888889 | 160.056 |
| 0.7208333333333333 | 160.056 |
| 0.7215277777777778 | 160.056 |
| 0.7222222222222222 | 164.605 |
| 0.7229166666666668 | 182.82 |
| 0.7236111111111111 | 182.82 |
| 0.7243055555555555 | 182.82 |
| 0.725 | 155.509 |
| 0.7256944444444445 | 150.964 |
| 0.7263888888888889 | 155.509 |
| 0.7270833333333333 | 160.056 |
| 0.7277777777777777 | 187.378 |
| 0.7284722222222223 | 196.497 |
| 0.7291666666666666 | 191.937 |
| 0.7298611111111111 | 196.497 |
| 0.7305555555555556 | 196.497 |
| 0.7312500000000001 | 191.937 |
| 0.7319444444444444 | 196.497 |
| 0.7326388888888888 | 196.497 |
| 0.7333333333333334 | 196.497 |
| 0.7340277777777778 | 196.497 |
| 0.7347222222222222 | 201.058 |
| 0.7354166666666666 | 196.497 |
| 0.7361111111111112 | 191.937 |
| 0.7368055555555556 | 196.497 |
| 0.7374999999999999 | 191.937 |
| 0.7381944444444444 | 191.937 |
| 0.7388888888888889 | 187.378 |
| 0.7395833333333334 | 182.82 |
| 0.7402777777777777 | 182.82 |
| 0.7409722222222223 | 182.82 |
| 0.7416666666666667 | 182.82 |
| 0.7423611111111111 | 178.264 |
| 0.7430555555555555 | 178.264 |
| 0.74375 | 178.264 |
| 0.7444444444444445 | 169.156 |
| 0.7451388888888889 | 150.964 |
| 0.7458333333333332 | 164.605 |
| 0.7465277777777778 | 160.056 |
| 0.7472222222222222 | 164.605 |
| 0.7479166666666667 | 160.056 |
| 0.748611111111111 | 155.509 |
| 0.7493055555555556 | 155.509 |
| 0.75 | 141.884 |
| 0.7506944444444444 | 123.758 |
| 0.751388888888889 | 119.235 |
| 0.7520833333333333 | 123.758 |
| 0.7527777777777778 | 119.235 |
| 0.7534722222222222 | 119.235 |
| 0.7541666666666668 | 119.235 |
| 0.7548611111111111 | 119.235 |
| 0.7555555555555555 | 119.235 |
| 0.75625 | 114.716 |
| 0.7569444444444445 | 114.716 |
| 0.7576388888888889 | 114.716 |
| 0.7583333333333333 | 114.716 |
| 0.7590277777777777 | 119.235 |
| 0.7597222222222223 | 119.235 |
| 0.7604166666666666 | 114.716 |
| 0.7611111111111111 | 110.201 |
| 0.7618055555555556 | 105.69 |
| 0.7625000000000001 | 101.184 |
| 0.7631944444444444 | 96.682 |
| 0.7638888888888888 | 96.682 |
| 0.7645833333333334 | 92.184 |
| 0.7652777777777778 | 87.692 |
| 0.7659722222222222 | 83.205 |
| 0.7666666666666666 | 78.722 |
| 0.7673611111111112 | 78.722 |
| 0.7680555555555556 | 78.722 |
| 0.7687499999999999 | 74.246 |
| 0.7694444444444444 | 74.246 |
| 0.7701388888888889 | 74.246 |
| 0.7708333333333334 | 69.775 |
| 0.7715277777777777 | 69.775 |
| 0.7722222222222223 | 65.31 |
| 0.7729166666666667 | 65.31 |
| 0.7736111111111111 | 65.31 |
| 0.7743055555555555 | 65.31 |
| 0.775 | 60.85 |
| 0.7756944444444445 | 60.85 |
| 0.7763888888888889 | 56.398 |
| 0.7770833333333332 | 56.398 |
| 0.7777777777777778 | 56.398 |
| 0.7784722222222222 | 56.398 |
| 0.7791666666666667 | 51.951 |
| 0.779861111111111 | 51.951 |
| 0.7805555555555556 | 47.511 |
| 0.78125 | 47.511 |
| 0.7819444444444444 | 47.511 |
| 0.782638888888889 | 47.511 |
| 0.7833333333333333 | 47.511 |
| 0.7840277777777778 | 47.511 |
| 0.7847222222222222 | 43.079 |
| 0.7854166666666668 | 43.079 |
| 0.7861111111111111 | 43.079 |
| 0.7868055555555555 | 38.653 |
| 0.7875 | 38.653 |
| 0.7881944444444445 | 38.653 |
| 0.7888888888888889 | 38.653 |
| 0.7895833333333333 | 34.234 |
| 0.7902777777777777 | 34.234 |
| 0.7909722222222223 | 34.234 |
| 0.7916666666666666 | 29.823 |
| 0.7923611111111111 | 29.823 |
| 0.7930555555555556 | 29.823 |
| 0.7937500000000001 | 29.823 |
| 0.7944444444444444 | 29.823 |
| 0.7951388888888888 | 25.419 |
| 0.7958333333333334 | 25.419 |
| 0.7965277777777778 | 21.024 |
| 0.7972222222222222 | 21.024 |
| 0.7979166666666666 | 21.024 |
| 0.7986111111111112 | 16.636 |
| 0.7993055555555556 | 16.636 |
| 0.7999999999999999 | 16.636 |
| 0.8006944444444444 | 12.257 |
| 0.8013888888888889 | 12.257 |
| 0.8020833333333334 | 12.257 |
| 0.8027777777777777 | 12.257 |
| 0.8034722222222223 | 12.257 |
| 0.8041666666666667 | 7.887 |
| 0.8048611111111111 | 7.887 |
| 0.8055555555555555 | 7.887 |
| 0.80625 | 7.887 |
| 0.8069444444444445 | 7.887 |
| 0.8076388888888889 | 7.887 |
| 0.8083333333333332 | 7.887 |
| 0.8090277777777778 | 3.525 |
| 0.8097222222222222 | 3.525 |
| 0.8104166666666667 | 3.525 |
| 0.811111111111111 | 3.525 |
| 0.8118055555555556 | 3.525 |
| 0.8125 | 3.525 |
| 0.8131944444444444 | 3.525 |
| 0.813888888888889 | 3.525 |
| 0.8145833333333333 | 3.525 |
| 0.8152777777777778 | 3.525 |
| 0.8159722222222222 | 3.525 |
| 0.8166666666666668 | 0 |
| 0.8173611111111111 | 0 |
| 0.8180555555555555 | 0 |
| 0.81875 | 0 |
| 0.8194444444444445 | 0 |
| 0.8201388888888889 | 0 |
| 0.8208333333333333 | 0 |
| 0.8215277777777777 | 0 |
| 0.8222222222222223 | 0 |
| 0.8229166666666666 | 0 |
| 0.8236111111111111 | 0 |
| 0.8243055555555556 | 0 |
| 0.8250000000000001 | 0 |
| 0.8256944444444444 | 0 |
| 0.8263888888888888 | 0 |
| 0.8270833333333334 | 0 |
| 0.8277777777777778 | 0 |
| 0.8284722222222222 | 0 |
| 0.8291666666666666 | 0 |
| 0.8298611111111112 | 0 |
| 0.8305555555555556 | 0 |
| 0.8312499999999999 | 0 |
| 0.8319444444444444 | 0 |
| 0.8326388888888889 | 0 |
| 0.8333333333333334 | 0 |
| 0.8340277777777777 | 0 |
| 0.8347222222222223 | 0 |
| 0.8354166666666667 | 0 |
| 0.8361111111111111 | 0 |
| 0.8368055555555555 | 0 |
| 0.8375 | 0 |
| 0.8381944444444445 | 0 |
| 0.8388888888888889 | 0 |
| 0.8395833333333332 | 0 |
| 0.8402777777777778 | 0 |
| 0.8409722222222222 | 0 |
| 0.8416666666666667 | 0 |
| 0.842361111111111 | 0 |
| 0.8430555555555556 | 0 |
| 0.84375 | 0 |
| 0.8444444444444444 | 0 |
| 0.845138888888889 | 0 |
| 0.8458333333333333 | 0 |
| 0.8465277777777778 | 0 |
| 0.8472222222222222 | 0 |
| 0.8479166666666668 | 0 |
| 0.8486111111111111 | 0 |
| 0.8493055555555555 | 0 |
| 0.85 | 0 |
| 0.8506944444444445 | 0 |
| 0.8513888888888889 | 0 |
| 0.8520833333333333 | 0 |
| 0.8527777777777777 | 0 |
| 0.8534722222222223 | 0 |
| 0.8541666666666666 | 0 |
| 0.8548611111111111 | 0 |
| 0.8555555555555556 | 0 |
| 0.8562500000000001 | 0 |
| 0.8569444444444444 | 0 |
| 0.8576388888888888 | 0 |
| 0.8583333333333334 | 0 |
| 0.8590277777777778 | 0 |
| 0.8597222222222222 | 0 |
| 0.8604166666666666 | 0 |
| 0.8611111111111112 | 0 |
| 0.8618055555555556 | 0 |
| 0.8624999999999999 | 0 |
| 0.8631944444444444 | 0 |
| 0.8638888888888889 | 0 |
| 0.8645833333333334 | 0 |
| 0.8652777777777777 | 0 |
| 0.8659722222222223 | 0 |
| 0.8666666666666667 | 0 |
| 0.8673611111111111 | 0 |
| 0.8680555555555555 | 0 |
| 0.86875 | 0 |
| 0.8694444444444445 | 0 |
| 0.8701388888888889 | 0 |
| 0.8708333333333332 | 0 |
| 0.8715277777777778 | 0 |
| 0.8722222222222222 | 0 |
| 0.8729166666666667 | 0 |
| 0.873611111111111 | 0 |
| 0.8743055555555556 | 0 |
| 0.875 | 0 |
| 0.8756944444444444 | 0 |
| 0.876388888888889 | 0 |
| 0.8770833333333333 | 0 |
| 0.8777777777777778 | 0 |
| 0.8784722222222222 | 0 |
| 0.8791666666666668 | 0 |
| 0.8798611111111111 | 0 |
| 0.8805555555555555 | 0 |
| 0.88125 | 0 |
| 0.8819444444444445 | 0 |
| 0.8826388888888889 | 0 |
| 0.8833333333333333 | 0 |
| 0.8840277777777777 | 0 |
| 0.8847222222222223 | 0 |
| 0.8854166666666666 | 0 |
| 0.8861111111111111 | 0 |
| 0.8868055555555556 | 0 |
| 0.8875000000000001 | 0 |
| 0.8881944444444444 | 0 |
| 0.8888888888888888 | 0 |
| 0.8895833333333334 | 0 |
| 0.8902777777777778 | 0 |
| 0.8909722222222222 | 0 |
| 0.8916666666666666 | 0 |
| 0.8923611111111112 | 0 |
| 0.8930555555555556 | 0 |
| 0.8937499999999999 | 0 |
| 0.8944444444444444 | 0 |
| 0.8951388888888889 | 0 |
| 0.8958333333333334 | 0 |
| 0.8965277777777777 | 0 |
| 0.8972222222222223 | 0 |
| 0.8979166666666667 | 0 |
| 0.8986111111111111 | 0 |
| 0.8993055555555555 | 0 |
| 0.9 | 0 |
| 0.9006944444444445 | 0 |
| 0.9013888888888889 | 0 |
| 0.9020833333333332 | 0 |
| 0.9027777777777778 | 0 |
| 0.9034722222222222 | 0 |
| 0.9041666666666667 | 0 |
| 0.904861111111111 | 0 |
| 0.9055555555555556 | 0 |
| 0.90625 | 0 |
| 0.9069444444444444 | 0 |
| 0.907638888888889 | 0 |
| 0.9083333333333333 | 0 |
| 0.9090277777777778 | 0 |
| 0.9097222222222222 | 0 |
| 0.9104166666666668 | 0 |
| 0.9111111111111111 | 0 |
| 0.9118055555555555 | 0 |
| 0.9125 | 0 |
| 0.9131944444444445 | 0 |
| 0.9138888888888889 | 0 |
| 0.9145833333333333 | 0 |
| 0.9152777777777777 | 0 |
| 0.9159722222222223 | 0 |
| 0.9166666666666666 | 0 |
| 0.9173611111111111 | 0 |
| 0.9180555555555556 | 0 |
| 0.9187500000000001 | 0 |
| 0.9194444444444444 | 0 |
| 0.9201388888888888 | 0 |
| 0.9208333333333334 | 0 |
| 0.9215277777777778 | 0 |
| 0.9222222222222222 | 0 |
| 0.9229166666666666 | 0 |
| 0.9236111111111112 | 0 |
| 0.9243055555555556 | 0 |
| 0.9249999999999999 | 0 |
| 0.9256944444444444 | 0 |
| 0.9263888888888889 | 0 |
| 0.9270833333333334 | 0 |
| 0.9277777777777777 | 0 |
| 0.9284722222222223 | 0 |
| 0.9291666666666667 | 0 |
| 0.9298611111111111 | 0 |
| 0.9305555555555555 | 0 |
| 0.93125 | 0 |
| 0.9319444444444445 | 0 |
| 0.9326388888888889 | 0 |
| 0.9333333333333332 | 0 |
| 0.9340277777777778 | 0 |
| 0.9347222222222222 | 0 |
| 0.9354166666666667 | 0 |
| 0.936111111111111 | 0 |
| 0.9368055555555556 | 0 |
| 0.9375 | 0 |
| 0.9381944444444444 | 0 |
| 0.938888888888889 | 0 |
| 0.9395833333333333 | 0 |
| 0.9402777777777778 | 0 |
| 0.9409722222222222 | 0 |
| 0.9416666666666668 | 0 |
| 0.9423611111111111 | 0 |
| 0.9430555555555555 | 0 |
| 0.94375 | 0 |
| 0.9444444444444445 | 0 |
| 0.9451388888888889 | 0 |
| 0.9458333333333333 | 0 |
| 0.9465277777777777 | 0 |
| 0.9472222222222223 | 0 |
| 0.9479166666666666 | 0 |
| 0.9486111111111111 | 0 |
| 0.9493055555555556 | 0 |
| 0.9500000000000001 | 0 |
| 0.9506944444444444 | 0 |
| 0.9513888888888888 | 0 |
| 0.9520833333333334 | 0 |
| 0.9527777777777778 | 0 |
| 0.9534722222222222 | 0 |
| 0.9541666666666666 | 0 |
| 0.9548611111111112 | 0 |
| 0.9555555555555556 | 0 |
| 0.9562499999999999 | 0 |
| 0.9569444444444444 | 0 |
| 0.9576388888888889 | 0 |
| 0.9583333333333334 | 0 |
| 0.9590277777777777 | 0 |
| 0.9597222222222223 | 0 |
| 0.9604166666666667 | 0 |
| 0.9611111111111111 | 0 |
| 0.9618055555555555 | 0 |
| 0.9625 | 0 |
| 0.9631944444444445 | 0 |
| 0.9638888888888889 | 0 |
| 0.9645833333333332 | 0 |
| 0.9652777777777778 | 0 |
| 0.9659722222222222 | 0 |
| 0.9666666666666667 | 0 |
| 0.967361111111111 | 0 |
| 0.9680555555555556 | 0 |
| 0.96875 | 0 |
| 0.9694444444444444 | 0 |
| 0.970138888888889 | 0 |
| 0.9708333333333333 | 0 |
| 0.9715277777777778 | 0 |
| 0.9722222222222222 | 0 |
| 0.9729166666666668 | 0 |
| 0.9736111111111111 | 0 |
| 0.9743055555555555 | 0 |
| 0.975 | 0 |
| 0.9756944444444445 | 0 |
| 0.9763888888888889 | 0 |
| 0.9770833333333333 | 0 |
| 0.9777777777777777 | 0 |
| 0.9784722222222223 | 0 |
| 0.9791666666666666 | 0 |
| 0.9798611111111111 | 0 |
| 0.9805555555555556 | 0 |
| 0.9812500000000001 | 0 |
| 0.9819444444444444 | 0 |
| 0.9826388888888888 | 0 |
| 0.9833333333333334 | 0 |
| 0.9840277777777778 | 0 |
| 0.9847222222222222 | 0 |
| 0.9854166666666666 | 0 |
| 0.9861111111111112 | 0 |
| 0.9868055555555556 | 0 |
| 0.9874999999999999 | 0 |
| 0.9881944444444444 | 0 |
| 0.9888888888888889 | 0 |
| 0.9895833333333334 | 0 |
| 0.9902777777777777 | 0 |
| 0.9909722222222223 | 0 |
| 0.9916666666666667 | 0 |
| 0.9923611111111111 | 0 |
| 0.9930555555555555 | 0 |
| 0.99375 | 0 |
| 0.9944444444444445 | 0 |
| 0.9951388888888889 | 0 |
| 0.9958333333333332 | 0 |
| 0.9965277777777778 | 0 |
| 0.9972222222222222 | 0 |
| 0.9979166666666667 | 0 |
| 0.998611111111111 | 0 |
| 0.9993055555555556 | 0 |